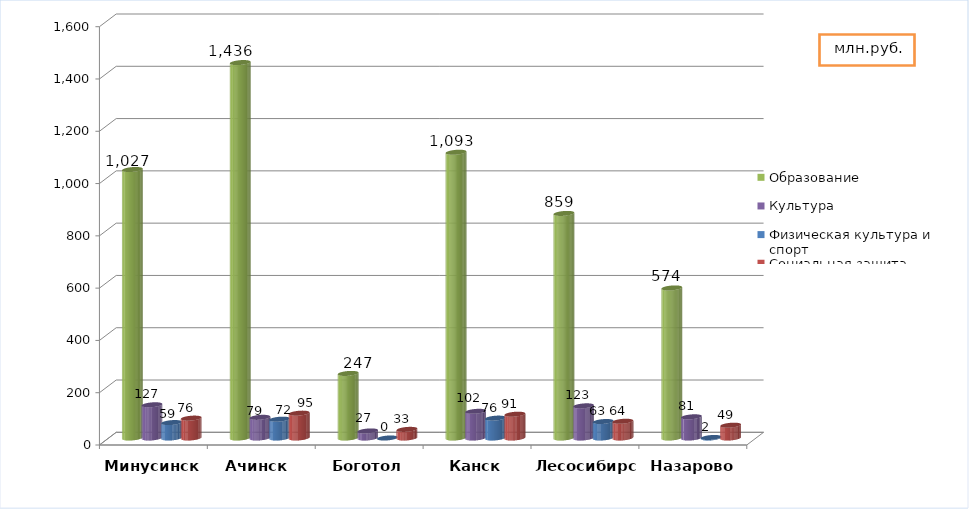
| Category | Образование | Культура | Физическая культура и спорт | Социальная защита |
|---|---|---|---|---|
| Минусинск | 1027 | 127 | 59 | 76 |
| Ачинск  | 1436 | 79 | 72 | 95 |
| Боготол | 247 | 27 | 0 | 33 |
| Канск | 1093 | 102 | 76 | 91 |
| Лесосибирск | 859 | 123 | 63 | 64 |
| Назарово | 574 | 81 | 2 | 49 |